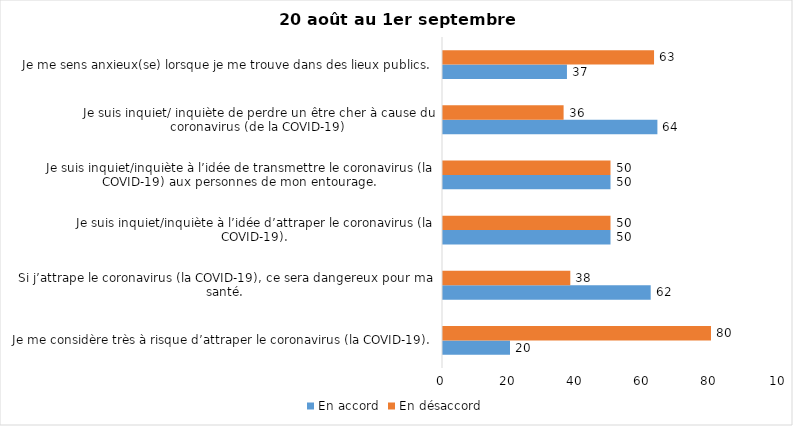
| Category | En accord | En désaccord |
|---|---|---|
| Je me considère très à risque d’attraper le coronavirus (la COVID-19). | 20 | 80 |
| Si j’attrape le coronavirus (la COVID-19), ce sera dangereux pour ma santé. | 62 | 38 |
| Je suis inquiet/inquiète à l’idée d’attraper le coronavirus (la COVID-19). | 50 | 50 |
| Je suis inquiet/inquiète à l’idée de transmettre le coronavirus (la COVID-19) aux personnes de mon entourage. | 50 | 50 |
| Je suis inquiet/ inquiète de perdre un être cher à cause du coronavirus (de la COVID-19) | 64 | 36 |
| Je me sens anxieux(se) lorsque je me trouve dans des lieux publics. | 37 | 63 |